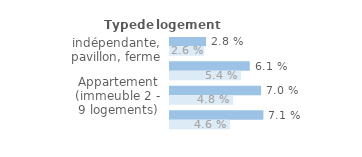
| Category | Series 1 | Series 0 |
|---|---|---|
| Maison indépendante, pavillon, ferme | 0.028 | 0.026 |
| Maison de ville groupée | 0.061 | 0.054 |
| Appartement (immeuble 2 - 9 logements) | 0.07 | 0.048 |
| Appartement (immeuble de 10 logements ou +) | 0.071 | 0.046 |